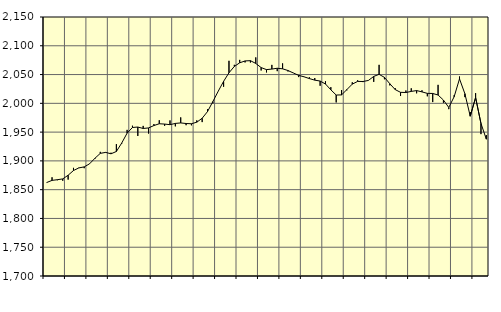
| Category | Piggar | Series 1 |
|---|---|---|
| nan | 1862.1 | 1862.42 |
| 1.0 | 1871.5 | 1866.12 |
| 1.0 | 1866.4 | 1867.33 |
| 1.0 | 1865.5 | 1868.67 |
| nan | 1867.5 | 1875.08 |
| 2.0 | 1887.9 | 1883.27 |
| 2.0 | 1888.2 | 1887.79 |
| 2.0 | 1887.3 | 1889.59 |
| nan | 1894.6 | 1894.94 |
| 3.0 | 1903.5 | 1904.54 |
| 3.0 | 1915.7 | 1913.06 |
| 3.0 | 1915.4 | 1914.78 |
| nan | 1914.2 | 1912.31 |
| 4.0 | 1929.1 | 1916.35 |
| 4.0 | 1930 | 1931.1 |
| 4.0 | 1953.9 | 1948.16 |
| nan | 1961.1 | 1958.06 |
| 5.0 | 1943.3 | 1958.8 |
| 5.0 | 1960.8 | 1956.31 |
| 5.0 | 1947.5 | 1957.27 |
| nan | 1964 | 1961.42 |
| 6.0 | 1970.6 | 1964.5 |
| 6.0 | 1960.9 | 1963.97 |
| 6.0 | 1970.3 | 1962.91 |
| nan | 1960 | 1965.12 |
| 7.0 | 1975.6 | 1965.96 |
| 7.0 | 1962 | 1964.94 |
| 7.0 | 1961.8 | 1964.55 |
| nan | 1970.4 | 1967.24 |
| 8.0 | 1967.4 | 1974.1 |
| 8.0 | 1989.7 | 1985.68 |
| 8.0 | 2000 | 2003.14 |
| nan | 2021 | 2021.08 |
| 9.0 | 2028.8 | 2038.2 |
| 9.0 | 2073.9 | 2053.06 |
| 9.0 | 2066.9 | 2064.12 |
| nan | 2075.5 | 2070.4 |
| 10.0 | 2071.1 | 2073.68 |
| 10.0 | 2070.9 | 2074.13 |
| 10.0 | 2079.8 | 2069.34 |
| nan | 2057.1 | 2062.1 |
| 11.0 | 2053.7 | 2058.57 |
| 11.0 | 2066.8 | 2059.53 |
| 11.0 | 2055.9 | 2060.96 |
| nan | 2069.4 | 2059.96 |
| 12.0 | 2055.4 | 2057.03 |
| 12.0 | 2052.9 | 2052.78 |
| 12.0 | 2045.6 | 2048.58 |
| nan | 2046 | 2046.13 |
| 13.0 | 2045.3 | 2043 |
| 13.0 | 2044 | 2040.29 |
| 13.0 | 2030.5 | 2038.74 |
| nan | 2038.4 | 2033.57 |
| 14.0 | 2028.1 | 2023.49 |
| 14.0 | 2001.6 | 2014.42 |
| 14.0 | 2023.1 | 2014.65 |
| nan | 2022.6 | 2023.93 |
| 15.0 | 2036.6 | 2033.41 |
| 15.0 | 2040.1 | 2038.08 |
| 15.0 | 2036.9 | 2037.95 |
| nan | 2039.9 | 2039.75 |
| 16.0 | 2037.3 | 2046.77 |
| 16.0 | 2066.9 | 2050.38 |
| 16.0 | 2041.8 | 2045.12 |
| nan | 2031.2 | 2034.06 |
| 17.0 | 2026.4 | 2023.89 |
| 17.0 | 2012.7 | 2019.1 |
| 17.0 | 2022.3 | 2018.81 |
| nan | 2026.1 | 2020.72 |
| 18.0 | 2017.4 | 2022.17 |
| 18.0 | 2022.7 | 2019.86 |
| 18.0 | 2012.2 | 2017.32 |
| nan | 2002.2 | 2017.16 |
| 19.0 | 2032.1 | 2014.43 |
| 19.0 | 2001 | 2005.67 |
| 19.0 | 1989.9 | 1992.86 |
| nan | 2014.1 | 2011.48 |
| 20.0 | 2046.6 | 2042.5 |
| 20.0 | 2010.8 | 2016.76 |
| 20.0 | 1984.8 | 1977.67 |
| nan | 2017.7 | 2009.96 |
| 21.0 | 1946.5 | 1965.1 |
| 21.0 | 1944.8 | 1937.7 |